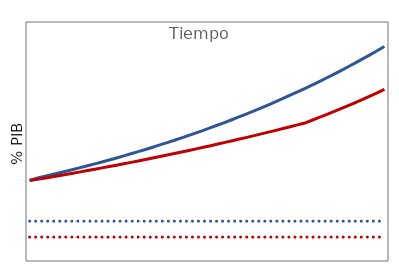
| Category | Spending (baseline) | Spending (reform) | Intertemporal pension balance |
|---|---|---|---|
| 0.0 | 1 | 1 | 0.3 |
| 1.0 | 1.01 | 1.01 | 0.3 |
| 1.0 | 1.02 | 1.01 | 0.3 |
| 2.0 | 1.04 | 1.025 | 0.3 |
| 3.0 | 1.061 | 1.04 | 0.3 |
| 4.0 | 1.082 | 1.055 | 0.3 |
| 5.0 | 1.104 | 1.071 | 0.3 |
| 6.0 | 1.126 | 1.087 | 0.3 |
| 7.0 | 1.149 | 1.103 | 0.3 |
| 8.0 | 1.172 | 1.119 | 0.3 |
| 9.0 | 1.195 | 1.135 | 0.3 |
| 10.0 | 1.219 | 1.152 | 0.3 |
| 11.0 | 1.243 | 1.169 | 0.3 |
| 12.0 | 1.268 | 1.186 | 0.3 |
| 13.0 | 1.294 | 1.203 | 0.3 |
| 14.0 | 1.319 | 1.221 | 0.3 |
| 15.0 | 1.346 | 1.238 | 0.3 |
| 16.0 | 1.373 | 1.256 | 0.3 |
| 17.0 | 1.4 | 1.274 | 0.3 |
| 18.0 | 1.428 | 1.293 | 0.3 |
| 19.0 | 1.457 | 1.311 | 0.3 |
| 20.0 | 1.486 | 1.33 | 0.3 |
| 21.0 | 1.516 | 1.349 | 0.3 |
| 22.0 | 1.546 | 1.368 | 0.3 |
| 23.0 | 1.577 | 1.388 | 0.3 |
| 24.0 | 1.608 | 1.407 | 0.3 |
| 25.0 | 1.641 | 1.427 | 0.3 |
| 26.0 | 1.673 | 1.448 | 0.3 |
| 27.0 | 1.707 | 1.468 | 0.3 |
| 28.0 | 1.741 | 1.489 | 0.3 |
| 29.0 | 1.776 | 1.509 | 0.3 |
| 30.0 | 1.811 | 1.531 | 0.3 |
| 31.0 | 1.848 | 1.552 | 0.3 |
| 32.0 | 1.885 | 1.574 | 0.3 |
| 33.0 | 1.922 | 1.595 | 0.3 |
| 34.0 | 1.961 | 1.618 | 0.3 |
| 35.0 | 2 | 1.64 | 0.3 |
| 36.0 | 2.04 | 1.663 | 0.3 |
| 37.0 | 2.081 | 1.685 | 0.3 |
| 38.0 | 2.122 | 1.708 | 0.3 |
| 39.0 | 2.165 | 1.732 | 0.3 |
| 40.0 | 2.208 | 1.766 | 0.3 |
| 41.0 | 2.252 | 1.802 | 0.3 |
| 42.0 | 2.297 | 1.838 | 0.3 |
| 43.0 | 2.343 | 1.875 | 0.3 |
| 44.0 | 2.39 | 1.912 | 0.3 |
| 45.0 | 2.438 | 1.95 | 0.3 |
| 46.0 | 2.487 | 1.989 | 0.3 |
| 47.0 | 2.536 | 2.029 | 0.3 |
| 48.0 | 2.587 | 2.07 | 0.3 |
| 49.0 | 2.639 | 2.111 | 0.3 |
| 50.0 | 2.692 | 2.153 | 0.3 |
| 51.0 | 2.745 | 2.196 | 0.3 |